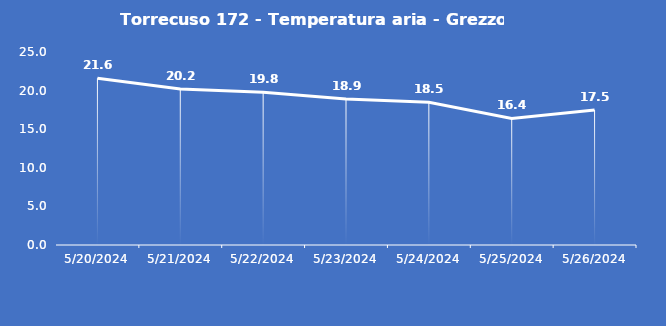
| Category | Torrecuso 172 - Temperatura aria - Grezzo (°C) |
|---|---|
| 5/20/24 | 21.6 |
| 5/21/24 | 20.2 |
| 5/22/24 | 19.8 |
| 5/23/24 | 18.9 |
| 5/24/24 | 18.5 |
| 5/25/24 | 16.4 |
| 5/26/24 | 17.5 |